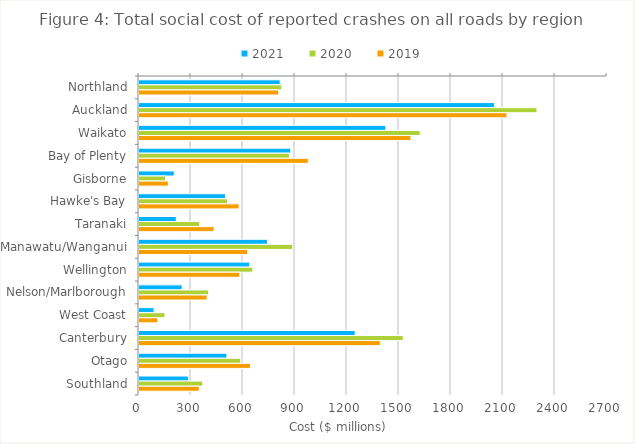
| Category | 2021 | 2020 | 2019 |
|---|---|---|---|
| Northland | 814.721 | 824.324 | 806.336 |
| Auckland | 2050.543 | 2296.121 | 2123.249 |
| Waikato | 1424.074 | 1622.346 | 1568.737 |
| Bay of Plenty | 875.39 | 868.835 | 976.69 |
| Gisborne | 203.29 | 153.726 | 169.376 |
| Hawke's Bay | 499.272 | 510.552 | 577.768 |
| Taranaki | 215.44 | 350.317 | 433.338 |
| Manawatu/Wanganui | 741.07 | 886.572 | 627.586 |
| Wellington | 639.108 | 657.048 | 581.834 |
| Nelson/Marlborough | 249.081 | 402.204 | 393.223 |
| West Coast | 87.062 | 149.932 | 109.412 |
| Canterbury | 1247.161 | 1524.78 | 1391.97 |
| Otago | 507.145 | 587.291 | 642.882 |
| Southland | 284.854 | 367.392 | 348.016 |